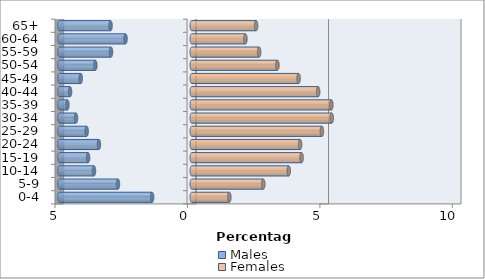
| Category | Males | Females |
|---|---|---|
| 0-4 | -1.498 | 1.418 |
| 5-9 | -2.787 | 2.698 |
| 10-14 | -3.693 | 3.662 |
| 15-19 | -3.914 | 4.146 |
| 20-24 | -3.506 | 4.091 |
| 25-29 | -3.969 | 4.912 |
| 30-34 | -4.372 | 5.285 |
| 35-39 | -4.696 | 5.269 |
| 40-44 | -4.596 | 4.772 |
| 45-49 | -4.191 | 4.034 |
| 50-54 | -3.64 | 3.234 |
| 55-59 | -3.049 | 2.543 |
| 60-64 | -2.503 | 2.025 |
| 65+ | -3.067 | 2.429 |